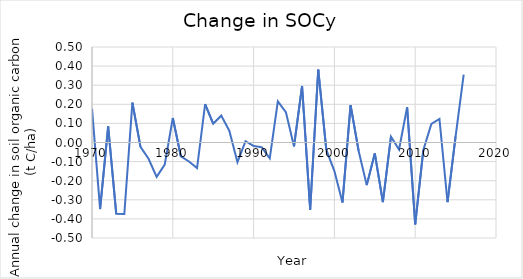
| Category | Series 0 |
|---|---|
| 1970.0 | 0.178 |
| 1971.0 | -0.348 |
| 1972.0 | 0.085 |
| 1973.0 | -0.374 |
| 1974.0 | -0.375 |
| 1975.0 | 0.209 |
| 1976.0 | -0.023 |
| 1977.0 | -0.085 |
| 1978.0 | -0.18 |
| 1979.0 | -0.116 |
| 1980.0 | 0.128 |
| 1981.0 | -0.073 |
| 1982.0 | -0.099 |
| 1983.0 | -0.134 |
| 1984.0 | 0.201 |
| 1985.0 | 0.098 |
| 1986.0 | 0.141 |
| 1987.0 | 0.061 |
| 1988.0 | -0.103 |
| 1989.0 | 0.007 |
| 1990.0 | -0.018 |
| 1991.0 | -0.025 |
| 1992.0 | -0.083 |
| 1993.0 | 0.215 |
| 1994.0 | 0.158 |
| 1995.0 | -0.021 |
| 1996.0 | 0.296 |
| 1997.0 | -0.352 |
| 1998.0 | 0.382 |
| 1999.0 | -0.039 |
| 2000.0 | -0.15 |
| 2001.0 | -0.314 |
| 2002.0 | 0.196 |
| 2003.0 | -0.044 |
| 2004.0 | -0.223 |
| 2005.0 | -0.057 |
| 2006.0 | -0.312 |
| 2007.0 | 0.031 |
| 2008.0 | -0.037 |
| 2009.0 | 0.185 |
| 2010.0 | -0.429 |
| 2011.0 | -0.041 |
| 2012.0 | 0.097 |
| 2013.0 | 0.123 |
| 2014.0 | -0.312 |
| 2015.0 | 0.033 |
| 2016.0 | 0.356 |